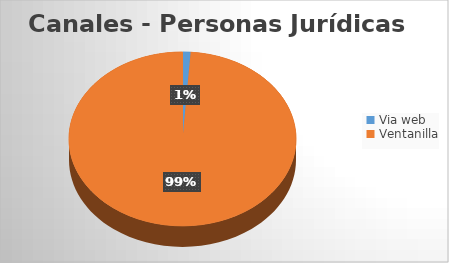
| Category | Series 0 |
|---|---|
| Via web | 2 |
| Ventanilla | 173 |